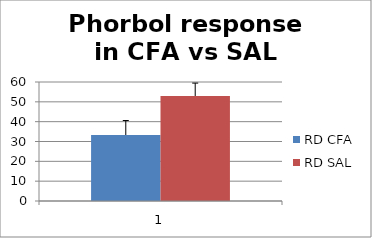
| Category | RD CFA | RD SAL |
|---|---|---|
| 0 | 33.273 | 52.947 |